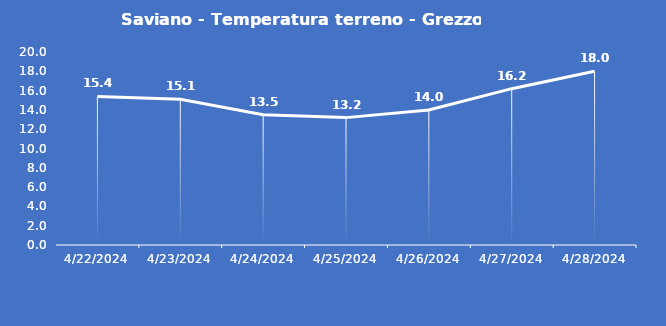
| Category | Saviano - Temperatura terreno - Grezzo (°C) |
|---|---|
| 4/22/24 | 15.4 |
| 4/23/24 | 15.1 |
| 4/24/24 | 13.5 |
| 4/25/24 | 13.2 |
| 4/26/24 | 14 |
| 4/27/24 | 16.2 |
| 4/28/24 | 18 |